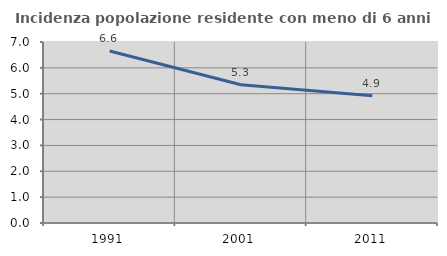
| Category | Incidenza popolazione residente con meno di 6 anni |
|---|---|
| 1991.0 | 6.649 |
| 2001.0 | 5.349 |
| 2011.0 | 4.921 |